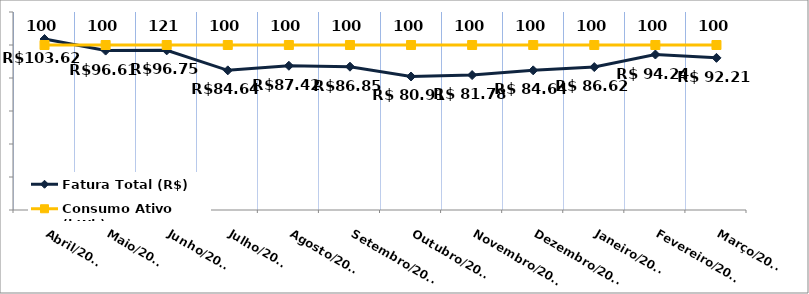
| Category | Fatura Total (R$) |
|---|---|
| Abril/2022 | 103.62 |
| Maio/2022 | 96.61 |
| Junho/2022 | 96.75 |
| Julho/2022 | 84.64 |
| Agosto/2022 | 87.42 |
| Setembro/2022 | 86.85 |
| Outubro/2022 | 80.91 |
| Novembro/2022 | 81.78 |
| Dezembro/2022 | 84.64 |
| Janeiro/2023 | 86.62 |
| Fevereiro/2023 | 94.24 |
| Março/2023 | 92.21 |